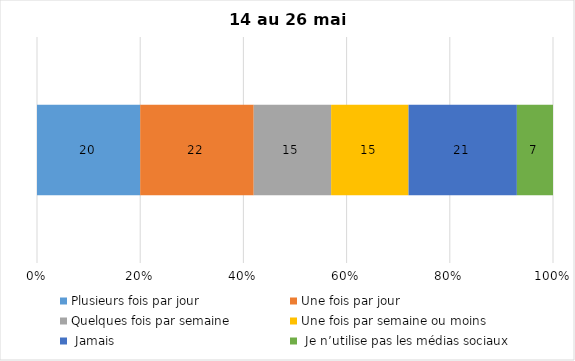
| Category | Plusieurs fois par jour | Une fois par jour | Quelques fois par semaine   | Une fois par semaine ou moins   |  Jamais   |  Je n’utilise pas les médias sociaux |
|---|---|---|---|---|---|---|
| 0 | 20 | 22 | 15 | 15 | 21 | 7 |